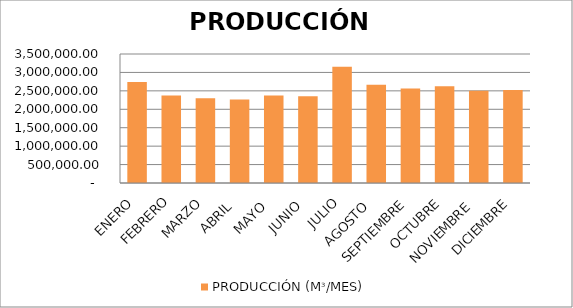
| Category | PRODUCCIÓN (Mᶟ/MES) |
|---|---|
| ENERO  | 2738908.7 |
| FEBRERO | 2373196.57 |
| MARZO | 2298142.4 |
| ABRIL  | 2266740.15 |
| MAYO  | 2374415.75 |
| JUNIO  | 2351590.81 |
| JULIO | 3153894.67 |
| AGOSTO  | 2668020.64 |
| SEPTIEMBRE | 2564608.95 |
| OCTUBRE | 2622656.15 |
| NOVIEMBRE  | 2505200.56 |
| DICIEMBRE | 2525656.13 |